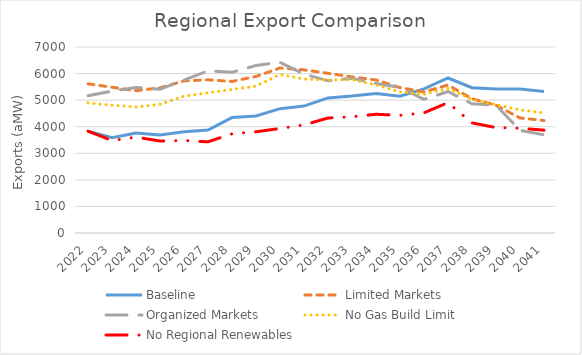
| Category | Baseline | Limited Markets | Organized Markets | No Gas Build Limit | No Regional Renewables |
|---|---|---|---|---|---|
| 2022.0 | 3832.412 | 5614.491 | 5167.959 | 4895.002 | 3832.412 |
| 2023.0 | 3586.47 | 5486.199 | 5341.168 | 4810.018 | 3481.604 |
| 2024.0 | 3761.49 | 5356.645 | 5479.698 | 4744.797 | 3605.691 |
| 2025.0 | 3685.977 | 5461.463 | 5413.022 | 4844.54 | 3462.752 |
| 2026.0 | 3814.137 | 5724.705 | 5756.682 | 5149.833 | 3480.735 |
| 2027.0 | 3876.007 | 5764.431 | 6102.647 | 5275.085 | 3431.219 |
| 2028.0 | 4344.486 | 5703.635 | 6046.218 | 5404.116 | 3731.626 |
| 2029.0 | 4405.371 | 5891.356 | 6306.484 | 5527.378 | 3808.633 |
| 2030.0 | 4679.43 | 6210.498 | 6419.781 | 5967.086 | 3934.328 |
| 2031.0 | 4777.201 | 6139.127 | 5982.838 | 5793.842 | 4067.229 |
| 2032.0 | 5082.463 | 6010.302 | 5727.142 | 5754.459 | 4327.556 |
| 2033.0 | 5153.176 | 5876.255 | 5827.673 | 5775.299 | 4374.923 |
| 2034.0 | 5253.185 | 5760.507 | 5629.332 | 5573.016 | 4468.341 |
| 2035.0 | 5145.548 | 5471.404 | 5476.966 | 5309.911 | 4429.15 |
| 2036.0 | 5424.034 | 5308.505 | 5029.309 | 5220.619 | 4523.232 |
| 2037.0 | 5833.48 | 5567.837 | 5324.289 | 5440.882 | 4906.279 |
| 2038.0 | 5467.667 | 5053.49 | 4860.882 | 5025.827 | 4142.916 |
| 2039.0 | 5417.546 | 4808.897 | 4812.827 | 4828.519 | 3967.573 |
| 2040.0 | 5422.503 | 4329.779 | 3863.954 | 4633.127 | 3943.075 |
| 2041.0 | 5321.605 | 4232.23 | 3693.183 | 4521.26 | 3870.348 |